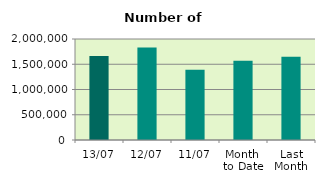
| Category | Series 0 |
|---|---|
| 13/07 | 1664846 |
| 12/07 | 1830864 |
| 11/07 | 1393070 |
| Month 
to Date | 1571226.444 |
| Last
Month | 1646651.818 |